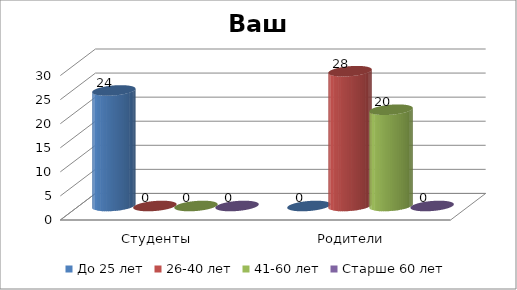
| Category | До 25 лет | 26-40 лет | 41-60 лет | Старше 60 лет |
|---|---|---|---|---|
| Студенты | 24 | 0 | 0 | 0 |
| Родители | 0 | 28 | 20 | 0 |